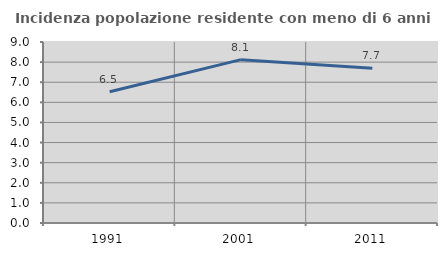
| Category | Incidenza popolazione residente con meno di 6 anni |
|---|---|
| 1991.0 | 6.528 |
| 2001.0 | 8.122 |
| 2011.0 | 7.692 |